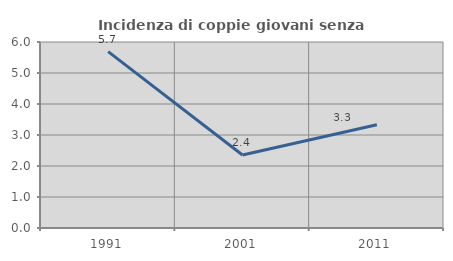
| Category | Incidenza di coppie giovani senza figli |
|---|---|
| 1991.0 | 5.691 |
| 2001.0 | 2.353 |
| 2011.0 | 3.333 |